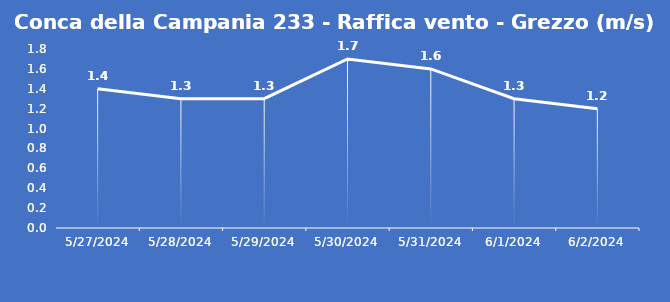
| Category | Conca della Campania 233 - Raffica vento - Grezzo (m/s) |
|---|---|
| 5/27/24 | 1.4 |
| 5/28/24 | 1.3 |
| 5/29/24 | 1.3 |
| 5/30/24 | 1.7 |
| 5/31/24 | 1.6 |
| 6/1/24 | 1.3 |
| 6/2/24 | 1.2 |